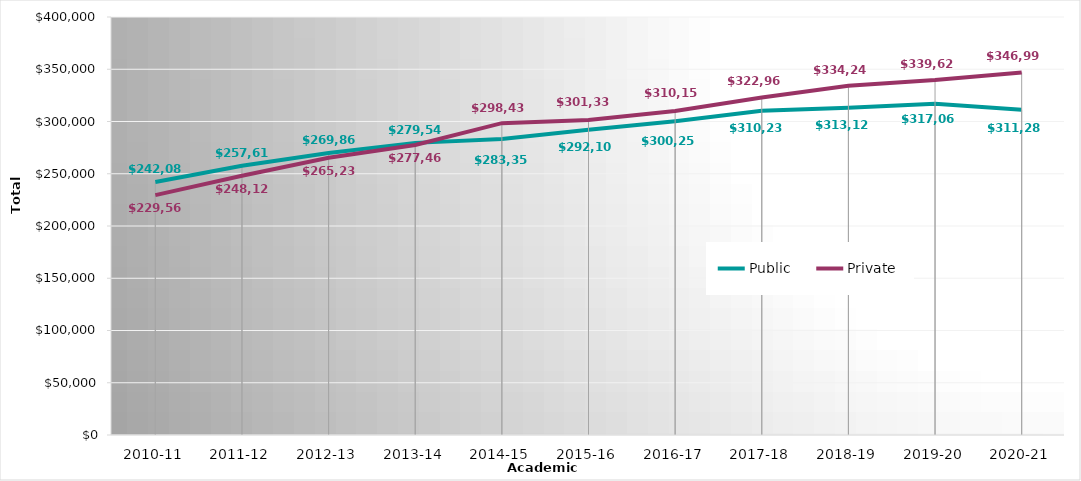
| Category | Public | Private |
|---|---|---|
| 2010-11 | 242081 | 229560 |
| 2011-12 | 257614 | 248129 |
| 2012-13 | 269868 | 265237 |
| 2013-14 | 279547 | 277463 |
| 2014-15 | 283356 | 298438 |
| 2015-16 | 292103.97 | 301337.21 |
| 2016-17 | 300252.49 | 310151.65 |
| 2017-18 | 310229.56 | 322960.58 |
| 2018-19 | 313129.36 | 334242.27 |
| 2019-20 | 317062.1 | 339627.93 |
| 2020-21 | 311282.77 | 346992.56 |